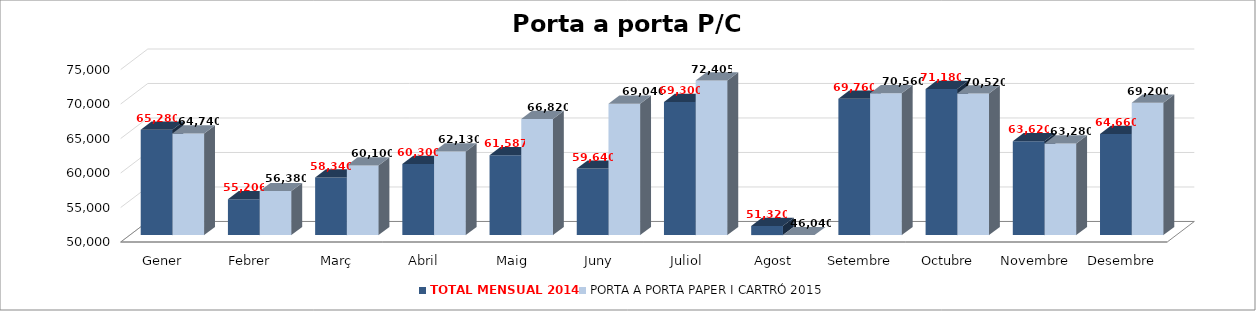
| Category | TOTAL MENSUAL 2014 | PORTA A PORTA PAPER I CARTRÓ 2015 |
|---|---|---|
| Gener | 65280 | 64740 |
| Febrer | 55206 | 56380 |
| Març | 58340 | 60100 |
| Abril | 60300 | 62130 |
| Maig | 61587 | 66820 |
| Juny | 59640 | 69040 |
| Juliol | 69300 | 72405 |
| Agost | 51320 | 46040 |
| Setembre | 69760 | 70560 |
| Octubre | 71180 | 70520 |
| Novembre | 63620 | 63280 |
| Desembre | 64660 | 69200 |